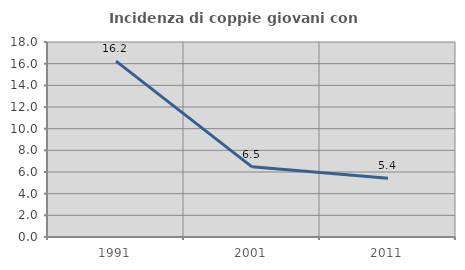
| Category | Incidenza di coppie giovani con figli |
|---|---|
| 1991.0 | 16.238 |
| 2001.0 | 6.478 |
| 2011.0 | 5.429 |